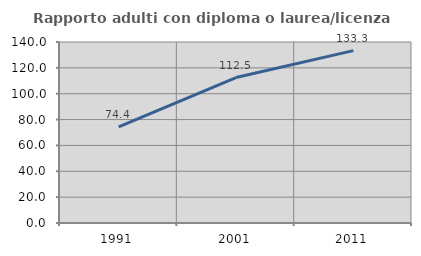
| Category | Rapporto adulti con diploma o laurea/licenza media  |
|---|---|
| 1991.0 | 74.419 |
| 2001.0 | 112.5 |
| 2011.0 | 133.333 |